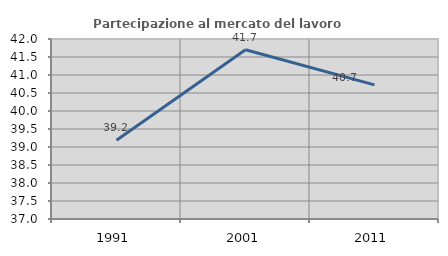
| Category | Partecipazione al mercato del lavoro  femminile |
|---|---|
| 1991.0 | 39.186 |
| 2001.0 | 41.703 |
| 2011.0 | 40.727 |